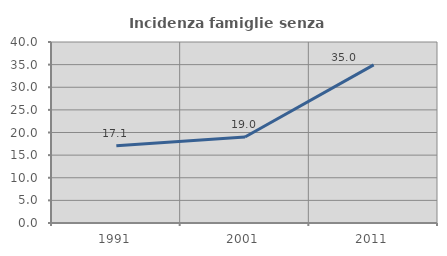
| Category | Incidenza famiglie senza nuclei |
|---|---|
| 1991.0 | 17.09 |
| 2001.0 | 19.015 |
| 2011.0 | 34.952 |